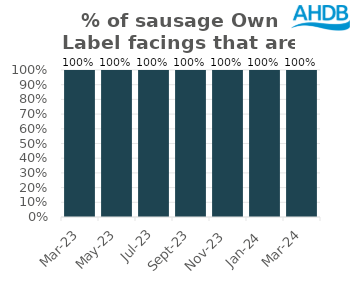
| Category | Sausage |
|---|---|
| 2023-03-01 | 1 |
| 2023-05-01 | 1 |
| 2023-07-01 | 1 |
| 2023-09-01 | 1 |
| 2023-11-01 | 1 |
| 2024-01-01 | 1 |
| 2024-03-01 | 1 |